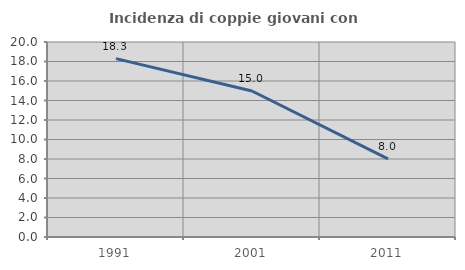
| Category | Incidenza di coppie giovani con figli |
|---|---|
| 1991.0 | 18.295 |
| 2001.0 | 14.974 |
| 2011.0 | 8.018 |